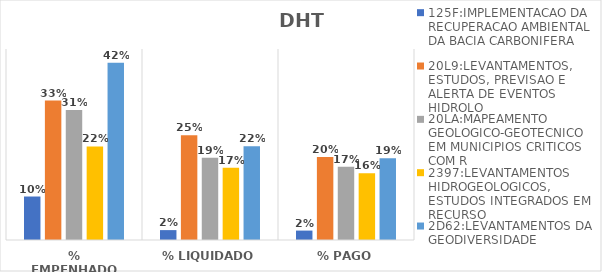
| Category | 125F:IMPLEMENTACAO DA RECUPERACAO AMBIENTAL DA BACIA CARBONIFERA | 20L9:LEVANTAMENTOS, ESTUDOS, PREVISAO E ALERTA DE EVENTOS HIDROLO | 20LA:MAPEAMENTO GEOLOGICO-GEOTECNICO EM MUNICIPIOS CRITICOS COM R | 2397:LEVANTAMENTOS HIDROGEOLOGICOS, ESTUDOS INTEGRADOS EM RECURSO | 2D62:LEVANTAMENTOS DA GEODIVERSIDADE |
|---|---|---|---|---|---|
| % EMPENHADO | 0.102 | 0.329 | 0.306 | 0.22 | 0.418 |
| % LIQUIDADO | 0.023 | 0.247 | 0.194 | 0.17 | 0.221 |
| % PAGO | 0.022 | 0.195 | 0.172 | 0.157 | 0.192 |